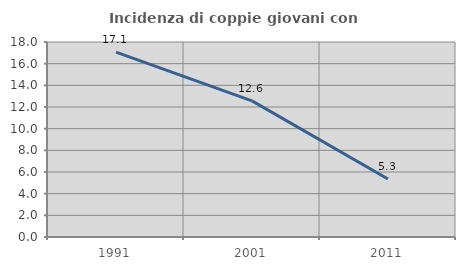
| Category | Incidenza di coppie giovani con figli |
|---|---|
| 1991.0 | 17.059 |
| 2001.0 | 12.565 |
| 2011.0 | 5.348 |